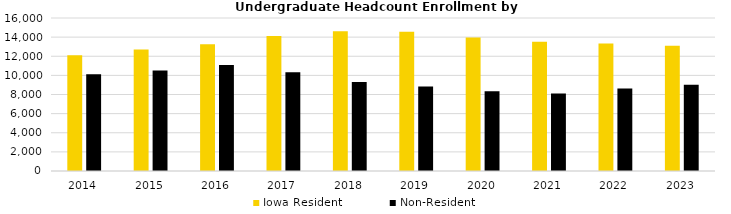
| Category | Iowa Resident | Non-Resident |
|---|---|---|
| 2014.0 | 12092 | 10126 |
| 2015.0 | 12718 | 10515 |
| 2016.0 | 13261 | 11094 |
| 2017.0 | 14115 | 10319 |
| 2018.0 | 14612 | 9297 |
| 2019.0 | 14573 | 8838 |
| 2020.0 | 13962 | 8342 |
| 2021.0 | 13504 | 8104 |
| 2022.0 | 13337 | 8636 |
| 2023.0 | 13106 | 9024 |